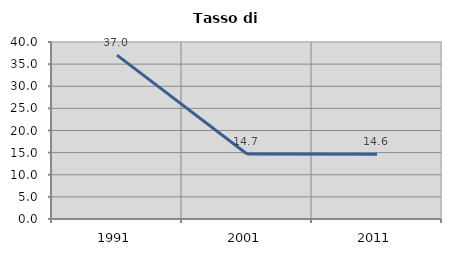
| Category | Tasso di disoccupazione   |
|---|---|
| 1991.0 | 37.042 |
| 2001.0 | 14.688 |
| 2011.0 | 14.641 |